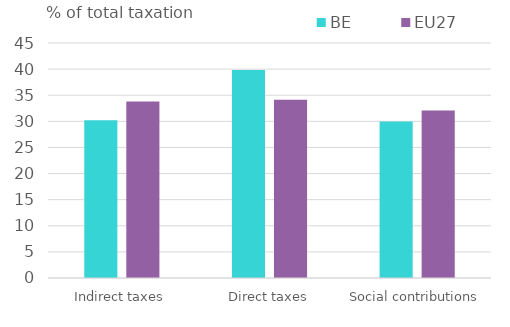
| Category | BE | EU27 |
|---|---|---|
| Indirect taxes | 30.215 | 33.811 |
| Direct taxes | 39.814 | 34.133 |
| Social contributions | 29.971 | 32.056 |